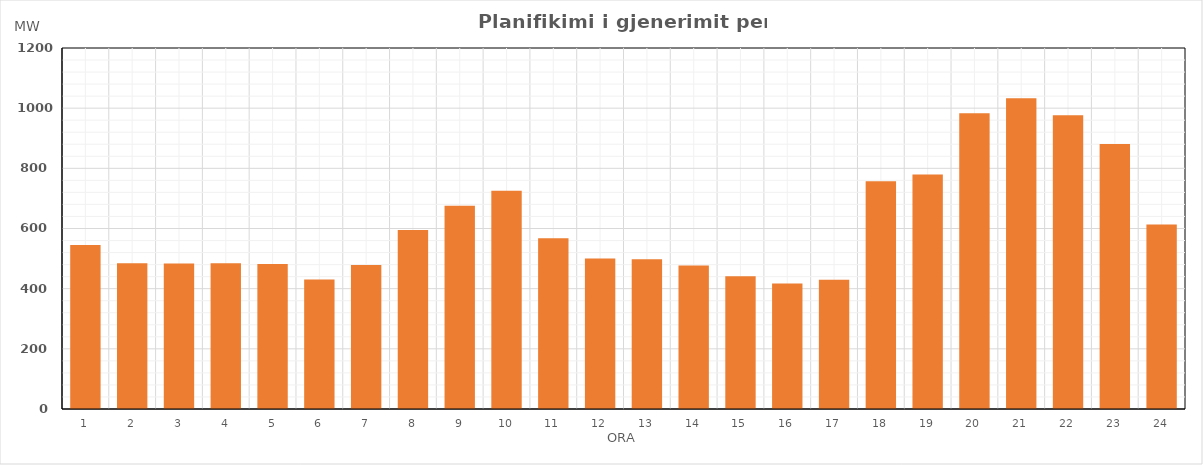
| Category | Max (MW) |
|---|---|
| 0 | 544.75 |
| 1 | 484.9 |
| 2 | 483.9 |
| 3 | 484.9 |
| 4 | 481.9 |
| 5 | 430.49 |
| 6 | 478.48 |
| 7 | 595.36 |
| 8 | 675.49 |
| 9 | 725.64 |
| 10 | 567.67 |
| 11 | 500.65 |
| 12 | 497.67 |
| 13 | 476.68 |
| 14 | 441.56 |
| 15 | 417.53 |
| 16 | 430.01 |
| 17 | 756.94 |
| 18 | 779.09 |
| 19 | 983.04 |
| 20 | 1032.55 |
| 21 | 976.59 |
| 22 | 880.48 |
| 23 | 613.49 |